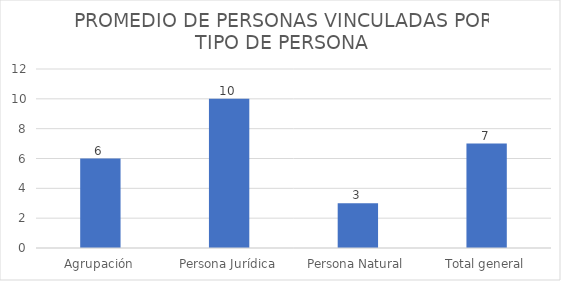
| Category | PROMEDIO |
|---|---|
| Agrupación | 6 |
| Persona Jurídica | 10 |
| Persona Natural | 3 |
| Total general | 7 |